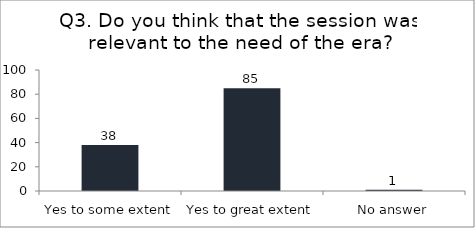
| Category | Q3. Do you think that the session was relevant to the need of the era? |
|---|---|
| Yes to some extent | 38 |
| Yes to great extent | 85 |
| No answer | 1 |